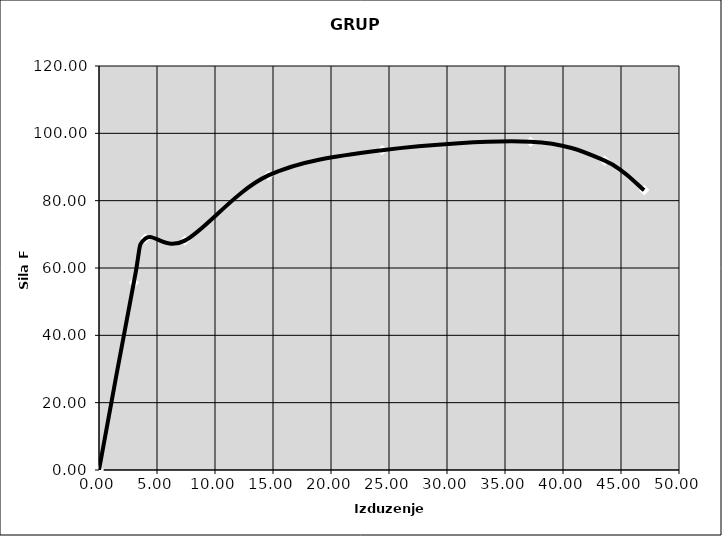
| Category | Series 0 |
|---|---|
| 0.0 | 0 |
| 3.0 | 55.625 |
| 4.0 | 68.75 |
| 7.4 | 68.125 |
| 14.600000000000001 | 87.5 |
| 24.400000000000002 | 95 |
| 37.2 | 97.5 |
| 43.6 | 91.875 |
| 47.0 | 83.125 |